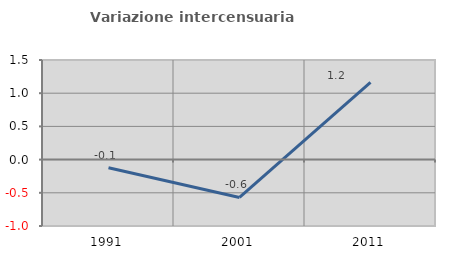
| Category | Variazione intercensuaria annua |
|---|---|
| 1991.0 | -0.122 |
| 2001.0 | -0.57 |
| 2011.0 | 1.163 |